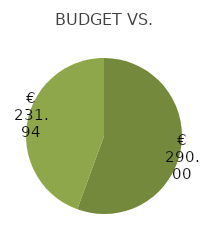
| Category | Series 0 |
|---|---|
| 0 | 290 |
| 1 | 231.94 |